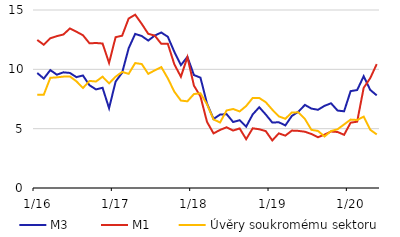
| Category | M3  | M1 | Úvěry soukromému sektoru |
|---|---|---|---|
|  1/16 | 9.691 | 12.477 | 7.853 |
| 2 | 9.221 | 12.071 | 7.865 |
| 3 | 9.937 | 12.619 | 9.286 |
| 4 | 9.548 | 12.796 | 9.325 |
| 5 | 9.747 | 12.937 | 9.385 |
| 6 | 9.696 | 13.442 | 9.403 |
| 7 | 9.341 | 13.169 | 8.992 |
| 8 | 9.484 | 12.872 | 8.426 |
| 9 | 8.659 | 12.193 | 9.022 |
| 10 | 8.307 | 12.218 | 8.975 |
| 11 | 8.449 | 12.177 | 9.38 |
| 12 | 6.723 | 10.54 | 8.816 |
|  1/17 | 8.966 | 12.711 | 9.379 |
| 2 | 9.714 | 12.834 | 9.781 |
| 3 | 11.775 | 14.282 | 9.62 |
| 4 | 12.987 | 14.606 | 10.528 |
| 5 | 12.808 | 13.83 | 10.445 |
| 6 | 12.425 | 12.993 | 9.619 |
| 7 | 12.849 | 12.842 | 9.914 |
| 8 | 13.105 | 12.147 | 10.193 |
| 9 | 12.743 | 12.148 | 9.238 |
| 10 | 11.473 | 10.419 | 8.113 |
| 11 | 10.355 | 9.377 | 7.368 |
| 12 | 11.047 | 11.032 | 7.305 |
|  1/18 | 9.516 | 8.626 | 7.918 |
| 2 | 9.298 | 7.714 | 7.983 |
| 3 | 7.121 | 5.573 | 7.051 |
| 4 | 5.819 | 4.602 | 5.78 |
| 5 | 6.185 | 4.894 | 5.522 |
| 6 | 6.228 | 5.118 | 6.536 |
| 7 | 5.561 | 4.84 | 6.657 |
| 8 | 5.712 | 5.02 | 6.454 |
| 9 | 5.172 | 4.113 | 6.908 |
| 10 | 6.2 | 5.031 | 7.59 |
| 11 | 6.807 | 4.95 | 7.588 |
| 12 | 6.195 | 4.794 | 7.229 |
|  1/19 | 5.516 | 4.009 | 6.6 |
| 2 | 5.54 | 4.604 | 6.035 |
| 3 | 5.275 | 4.413 | 5.835 |
| 4 | 6.075 | 4.839 | 6.369 |
| 5 | 6.427 | 4.813 | 6.374 |
| 6 | 7.002 | 4.742 | 5.815 |
| 7 | 6.692 | 4.549 | 4.899 |
| 8 | 6.591 | 4.278 | 4.808 |
| 9 | 6.924 | 4.5 | 4.343 |
| 10 | 7.14 | 4.758 | 4.797 |
| 11 | 6.526 | 4.72 | 4.948 |
| 12 | 6.463 | 4.481 | 5.357 |
|  1/20 | 8.164 | 5.503 | 5.765 |
| 2 | 8.253 | 5.59 | 5.73 |
| 3 | 9.419 | 8.44 | 6.009 |
| 4 | 8.269 | 9.253 | 4.908 |
| 5 | 7.805 | 10.442 | 4.515 |